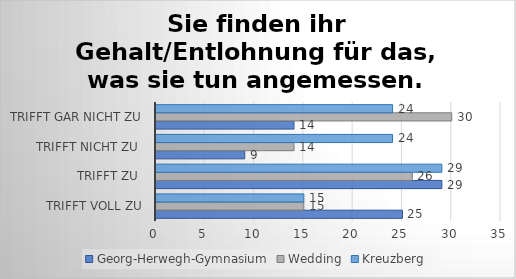
| Category | Georg-Herwegh-Gymnasium | Wedding | Kreuzberg |
|---|---|---|---|
| trifft voll zu | 25 | 15 | 15 |
| trifft zu  | 29 | 26 | 29 |
| trifft nicht zu  | 9 | 14 | 24 |
| trifft gar nicht zu | 14 | 30 | 24 |